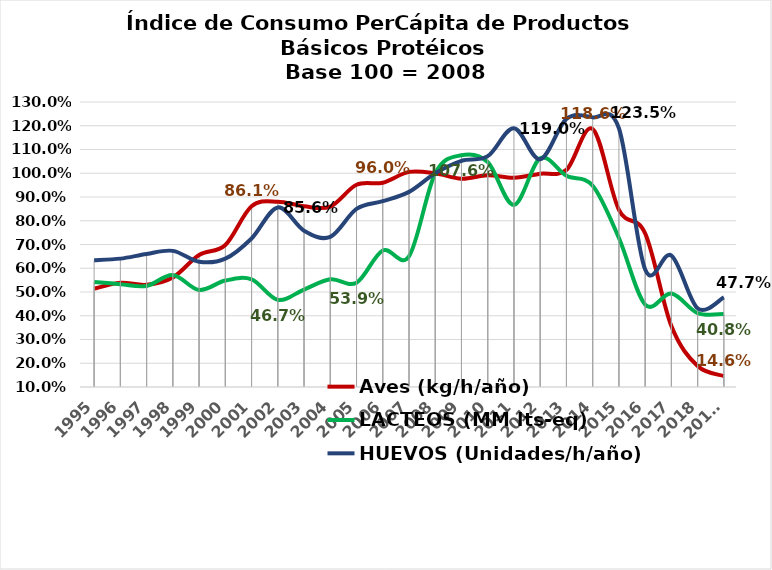
| Category | Aves (kg/h/año) | LACTEOS (MM lts-eq) | HUEVOS (Unidades/h/año) |
|---|---|---|---|
| 1995 | 0.514 | 0.542 | 0.634 |
| 1996 | 0.539 | 0.533 | 0.641 |
| 1997 | 0.53 | 0.525 | 0.66 |
| 1998 | 0.561 | 0.572 | 0.673 |
| 1999 | 0.656 | 0.509 | 0.627 |
| 2000 | 0.698 | 0.548 | 0.641 |
| 2001 | 0.861 | 0.553 | 0.725 |
| 2002 | 0.88 | 0.467 | 0.856 |
| 2003 | 0.861 | 0.51 | 0.758 |
| 2004 | 0.86 | 0.553 | 0.732 |
| 2005 | 0.952 | 0.539 | 0.85 |
| 2006 | 0.96 | 0.675 | 0.882 |
| 2007 | 1.006 | 0.65 | 0.922 |
| 2008 | 1 | 1 | 1 |
| 2009 | 0.977 | 1.076 | 1.052 |
| 2010 | 0.992 | 1.047 | 1.072 |
| 2011 | 0.981 | 0.867 | 1.19 |
| 2012 | 0.998 | 1.063 | 1.059 |
| 2013 | 1.014 | 0.989 | 1.229 |
| 2014 | 1.186 | 0.948 | 1.235 |
| 2015 | 0.846 | 0.728 | 1.19 |
| 2016 | 0.747 | 0.447 | 0.595 |
| 2017 | 0.356 | 0.493 | 0.654 |
| 2018 | 0.188 | 0.412 | 0.431 |
| 2019* | 0.146 | 0.408 | 0.477 |